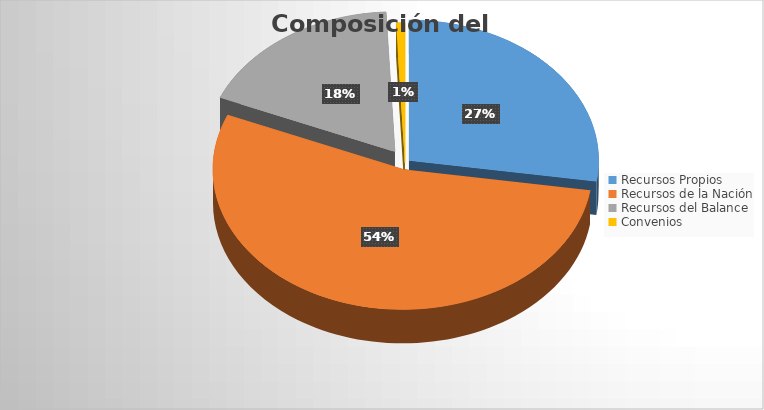
| Category | Series 0 |
|---|---|
| Recursos Propios | 48976988241.176 |
| Recursos de la Nación | 96462583539.82 |
| Recursos del Balance | 32095283336.71 |
| Convenios | 1336823529 |